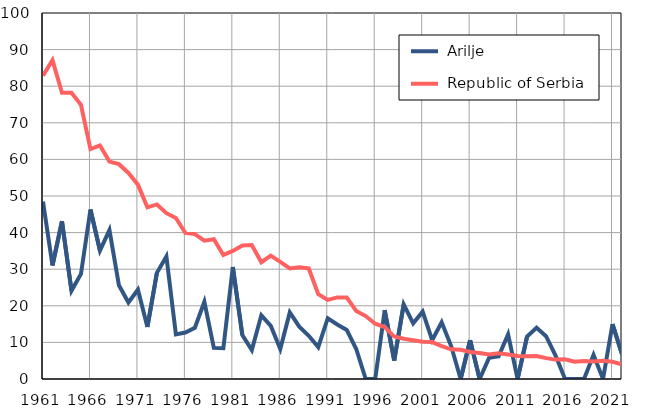
| Category |  Arilje |  Republic of Serbia |
|---|---|---|
| 1961.0 | 48.5 | 82.9 |
| 1962.0 | 31 | 87.1 |
| 1963.0 | 43.1 | 78.2 |
| 1964.0 | 24.1 | 78.2 |
| 1965.0 | 28.7 | 74.9 |
| 1966.0 | 46.3 | 62.8 |
| 1967.0 | 35.1 | 63.8 |
| 1968.0 | 40.7 | 59.4 |
| 1969.0 | 25.6 | 58.7 |
| 1970.0 | 20.9 | 56.3 |
| 1971.0 | 24.4 | 53.1 |
| 1972.0 | 14.2 | 46.9 |
| 1973.0 | 29 | 47.7 |
| 1974.0 | 33.5 | 45.3 |
| 1975.0 | 12.2 | 44 |
| 1976.0 | 12.7 | 39.9 |
| 1977.0 | 14 | 39.6 |
| 1978.0 | 21.1 | 37.8 |
| 1979.0 | 8.5 | 38.2 |
| 1980.0 | 8.4 | 33.9 |
| 1981.0 | 30.6 | 35 |
| 1982.0 | 12 | 36.5 |
| 1983.0 | 7.9 | 36.6 |
| 1984.0 | 17.4 | 31.9 |
| 1985.0 | 14.5 | 33.7 |
| 1986.0 | 8.2 | 32 |
| 1987.0 | 18.2 | 30.2 |
| 1988.0 | 14.3 | 30.5 |
| 1989.0 | 11.8 | 30.2 |
| 1990.0 | 8.7 | 23.2 |
| 1991.0 | 16.6 | 21.6 |
| 1992.0 | 14.9 | 22.3 |
| 1993.0 | 13.4 | 22.3 |
| 1994.0 | 8.2 | 18.6 |
| 1995.0 | 0 | 17.2 |
| 1996.0 | 0 | 15.1 |
| 1997.0 | 18.8 | 14.2 |
| 1998.0 | 5 | 11.6 |
| 1999.0 | 20.4 | 11 |
| 2000.0 | 15.2 | 10.6 |
| 2001.0 | 18.4 | 10.2 |
| 2002.0 | 10.6 | 10.1 |
| 2003.0 | 15.5 | 9 |
| 2004.0 | 9 | 8.1 |
| 2005.0 | 0 | 8 |
| 2006.0 | 10.6 | 7.4 |
| 2007.0 | 0 | 7.1 |
| 2008.0 | 5.8 | 6.7 |
| 2009.0 | 6.2 | 7 |
| 2010.0 | 12.2 | 6.7 |
| 2011.0 | 0 | 6.3 |
| 2012.0 | 11.6 | 6.2 |
| 2013.0 | 14 | 6.3 |
| 2014.0 | 11.7 | 5.7 |
| 2015.0 | 6.4 | 5.3 |
| 2016.0 | 0 | 5.4 |
| 2017.0 | 0 | 4.7 |
| 2018.0 | 0 | 4.9 |
| 2019.0 | 6.6 | 4.8 |
| 2020.0 | 0 | 5 |
| 2021.0 | 15 | 4.7 |
| 2022.0 | 6.8 | 4 |